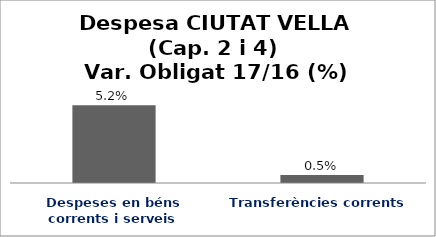
| Category | Series 0 |
|---|---|
| Despeses en béns corrents i serveis | 0.052 |
| Transferències corrents | 0.005 |